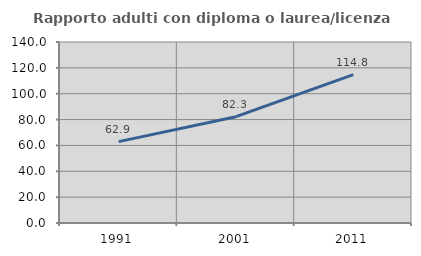
| Category | Rapporto adulti con diploma o laurea/licenza media  |
|---|---|
| 1991.0 | 62.948 |
| 2001.0 | 82.253 |
| 2011.0 | 114.78 |